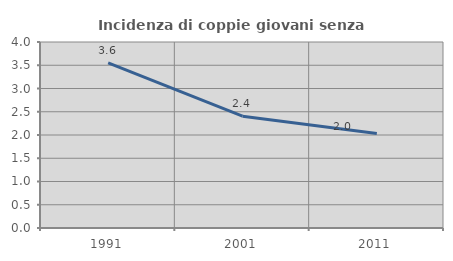
| Category | Incidenza di coppie giovani senza figli |
|---|---|
| 1991.0 | 3.55 |
| 2001.0 | 2.405 |
| 2011.0 | 2.032 |